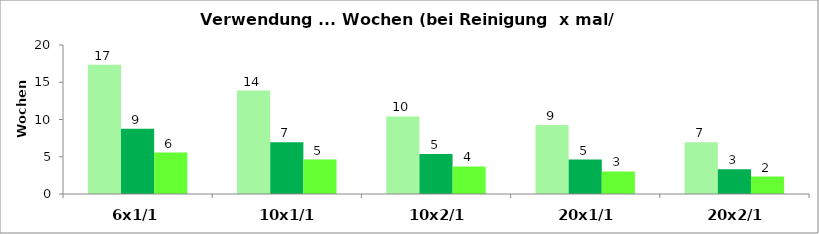
| Category | LEICHT | MITTEL | INTENSIV |
|---|---|---|---|
| 6x1/1 | 17.361 | 8.772 | 5.556 |
| 10x1/1 | 13.889 | 6.944 | 4.63 |
| 10x2/1 | 10.417 | 5.376 | 3.704 |
| 20x1/1 | 9.259 | 4.63 | 3.03 |
| 20x2/1 | 6.944 | 3.333 | 2.347 |